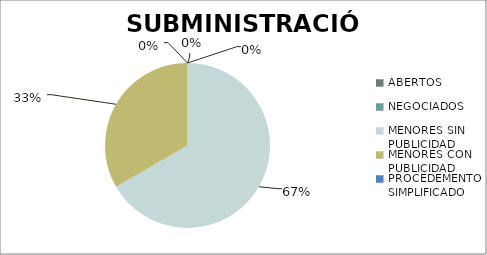
| Category | Series 0 |
|---|---|
| ABERTOS  | 0 |
| NEGOCIADOS  | 0 |
| MENORES SIN PUBLICIDAD | 12 |
| MENORES CON PUBLICIDAD | 6 |
| PROCEDEMENTO SIMPLIFICADO | 0 |